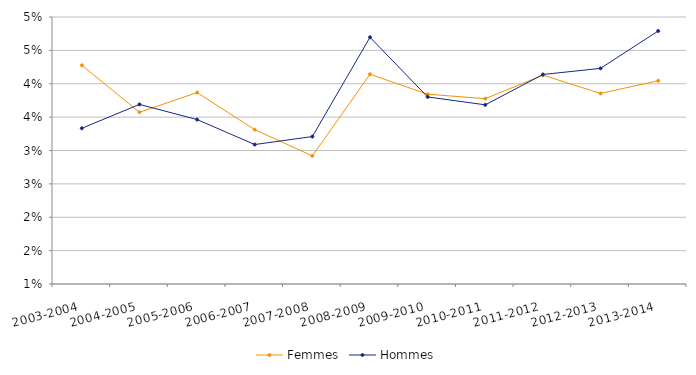
| Category | Femmes | Hommes |
|---|---|---|
| 2003-2004 | 0.043 | 0.033 |
| 2004-2005 | 0.036 | 0.037 |
| 2005-2006 | 0.039 | 0.035 |
| 2006-2007 | 0.033 | 0.031 |
| 2007-2008 | 0.029 | 0.032 |
| 2008-2009 | 0.041 | 0.047 |
| 2009-2010 | 0.038 | 0.038 |
| 2010-2011 | 0.038 | 0.037 |
| 2011-2012 | 0.041 | 0.041 |
| 2012-2013 | 0.039 | 0.042 |
| 2013-2014 | 0.04 | 0.048 |